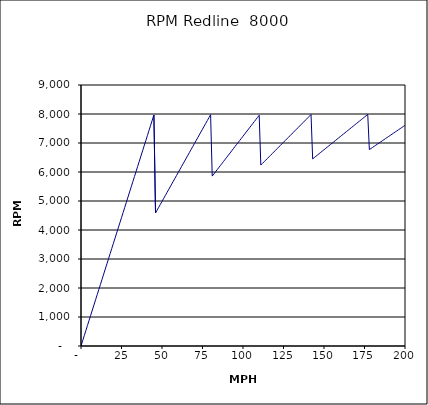
| Category | RPM Redline  8000 |
|---|---|
| 0.0 | 0 |
| 1.0 | 177.051 |
| 2.0 | 354.101 |
| 3.0 | 531.152 |
| 4.0 | 708.202 |
| 5.0 | 885.253 |
| 6.0 | 1062.303 |
| 7.0 | 1239.354 |
| 8.0 | 1416.405 |
| 9.0 | 1593.455 |
| 10.0 | 1770.506 |
| 11.0 | 1947.556 |
| 12.0 | 2124.607 |
| 13.0 | 2301.657 |
| 14.0 | 2478.708 |
| 15.0 | 2655.758 |
| 16.0 | 2832.809 |
| 17.0 | 3009.86 |
| 18.0 | 3186.91 |
| 19.0 | 3363.961 |
| 20.0 | 3541.011 |
| 21.0 | 3718.062 |
| 22.0 | 3895.112 |
| 23.0 | 4072.163 |
| 24.0 | 4249.214 |
| 25.0 | 4426.264 |
| 26.0 | 4603.315 |
| 27.0 | 4780.365 |
| 28.0 | 4957.416 |
| 29.0 | 5134.466 |
| 30.0 | 5311.517 |
| 31.0 | 5488.567 |
| 32.0 | 5665.618 |
| 33.0 | 5842.669 |
| 34.0 | 6019.719 |
| 35.0 | 6196.77 |
| 36.0 | 6373.82 |
| 37.0 | 6550.871 |
| 38.0 | 6727.921 |
| 39.0 | 6904.972 |
| 40.0 | 7082.023 |
| 41.0 | 7259.073 |
| 42.0 | 7436.124 |
| 43.0 | 7613.174 |
| 44.0 | 7790.225 |
| 45.0 | 7967.275 |
| 46.0 | 4586.031 |
| 47.0 | 4685.727 |
| 48.0 | 4785.424 |
| 49.0 | 4885.12 |
| 50.0 | 4984.816 |
| 51.0 | 5084.513 |
| 52.0 | 5184.209 |
| 53.0 | 5283.905 |
| 54.0 | 5383.602 |
| 55.0 | 5483.298 |
| 56.0 | 5582.994 |
| 57.0 | 5682.691 |
| 58.0 | 5782.387 |
| 59.0 | 5882.083 |
| 60.0 | 5981.78 |
| 61.0 | 6081.476 |
| 62.0 | 6181.172 |
| 63.0 | 6280.869 |
| 64.0 | 6380.565 |
| 65.0 | 6480.261 |
| 66.0 | 6579.958 |
| 67.0 | 6679.654 |
| 68.0 | 6779.35 |
| 69.0 | 6879.047 |
| 70.0 | 6978.743 |
| 71.0 | 7078.439 |
| 72.0 | 7178.136 |
| 73.0 | 7277.832 |
| 74.0 | 7377.528 |
| 75.0 | 7477.225 |
| 76.0 | 7576.921 |
| 77.0 | 7676.617 |
| 78.0 | 7776.314 |
| 79.0 | 7876.01 |
| 80.0 | 7975.706 |
| 81.0 | 5859.362 |
| 82.0 | 5931.7 |
| 83.0 | 6004.038 |
| 84.0 | 6076.375 |
| 85.0 | 6148.713 |
| 86.0 | 6221.051 |
| 87.0 | 6293.389 |
| 88.0 | 6365.727 |
| 89.0 | 6438.064 |
| 90.0 | 6510.402 |
| 91.0 | 6582.74 |
| 92.0 | 6655.078 |
| 93.0 | 6727.416 |
| 94.0 | 6799.753 |
| 95.0 | 6872.091 |
| 96.0 | 6944.429 |
| 97.0 | 7016.767 |
| 98.0 | 7089.105 |
| 99.0 | 7161.442 |
| 100.0 | 7233.78 |
| 101.0 | 7306.118 |
| 102.0 | 7378.456 |
| 103.0 | 7450.794 |
| 104.0 | 7523.131 |
| 105.0 | 7595.469 |
| 106.0 | 7667.807 |
| 107.0 | 7740.145 |
| 108.0 | 7812.483 |
| 109.0 | 7884.82 |
| 110.0 | 7957.158 |
| 111.0 | 6238.925 |
| 112.0 | 6295.131 |
| 113.0 | 6351.338 |
| 114.0 | 6407.544 |
| 115.0 | 6463.751 |
| 116.0 | 6519.957 |
| 117.0 | 6576.164 |
| 118.0 | 6632.37 |
| 119.0 | 6688.577 |
| 120.0 | 6744.783 |
| 121.0 | 6800.99 |
| 122.0 | 6857.196 |
| 123.0 | 6913.403 |
| 124.0 | 6969.609 |
| 125.0 | 7025.816 |
| 126.0 | 7082.023 |
| 127.0 | 7138.229 |
| 128.0 | 7194.436 |
| 129.0 | 7250.642 |
| 130.0 | 7306.849 |
| 131.0 | 7363.055 |
| 132.0 | 7419.262 |
| 133.0 | 7475.468 |
| 134.0 | 7531.675 |
| 135.0 | 7587.881 |
| 136.0 | 7644.088 |
| 137.0 | 7700.294 |
| 138.0 | 7756.501 |
| 139.0 | 7812.707 |
| 140.0 | 7868.914 |
| 141.0 | 7925.12 |
| 142.0 | 7981.327 |
| 143.0 | 6451.75 |
| 144.0 | 6496.867 |
| 145.0 | 6541.984 |
| 146.0 | 6587.101 |
| 147.0 | 6632.218 |
| 148.0 | 6677.336 |
| 149.0 | 6722.453 |
| 150.0 | 6767.57 |
| 151.0 | 6812.687 |
| 152.0 | 6857.804 |
| 153.0 | 6902.921 |
| 154.0 | 6948.038 |
| 155.0 | 6993.155 |
| 156.0 | 7038.273 |
| 157.0 | 7083.39 |
| 158.0 | 7128.507 |
| 159.0 | 7173.624 |
| 160.0 | 7218.741 |
| 161.0 | 7263.858 |
| 162.0 | 7308.975 |
| 163.0 | 7354.093 |
| 164.0 | 7399.21 |
| 165.0 | 7444.327 |
| 166.0 | 7489.444 |
| 167.0 | 7534.561 |
| 168.0 | 7579.678 |
| 169.0 | 7624.795 |
| 170.0 | 7669.912 |
| 171.0 | 7715.03 |
| 172.0 | 7760.147 |
| 173.0 | 7805.264 |
| 174.0 | 7850.381 |
| 175.0 | 7895.498 |
| 176.0 | 7940.615 |
| 177.0 | 7985.732 |
| 178.0 | 6772.454 |
| 179.0 | 6810.502 |
| 180.0 | 6848.549 |
| 181.0 | 6886.597 |
| 182.0 | 6924.644 |
| 183.0 | 6962.692 |
| 184.0 | 7000.739 |
| 185.0 | 7038.787 |
| 186.0 | 7076.834 |
| 187.0 | 7114.882 |
| 188.0 | 7152.929 |
| 189.0 | 7190.977 |
| 190.0 | 7229.024 |
| 191.0 | 7267.072 |
| 192.0 | 7305.119 |
| 193.0 | 7343.167 |
| 194.0 | 7381.214 |
| 195.0 | 7419.262 |
| 196.0 | 7457.309 |
| 197.0 | 7495.357 |
| 198.0 | 7533.404 |
| 199.0 | 7571.452 |
| 200.0 | 7609.499 |